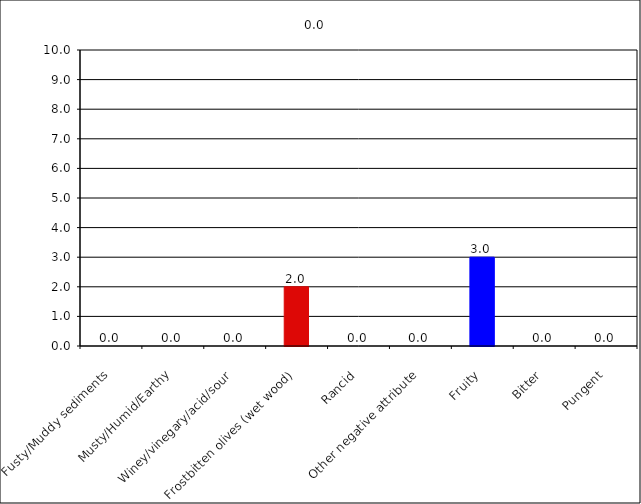
| Category | 0.0 |
|---|---|
| Fusty/Muddy sediments | 0 |
| Musty/Humid/Earthy | 0 |
| Winey/vinegary/acid/sour | 0 |
| Frostbitten olives (wet wood) | 2 |
| Rancid | 0 |
| Other negative attribute | 0 |
| Fruity | 3 |
| Bitter | 0 |
| Pungent | 0 |